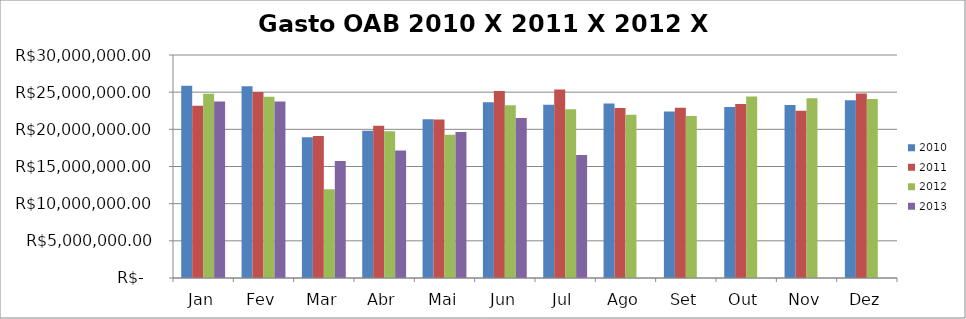
| Category | 2010 | 2011 | 2012 | 2013 |
|---|---|---|---|---|
| Jan | 25865872.94 | 23170130.5 | 24780138.68 | 23753127.04 |
| Fev | 25808496.98 | 25028056.29 | 24372694.95 | 23729691.57 |
| Mar | 18942208.98 | 19094225.19 | 11955866.25 | 15731767.78 |
| Abr | 19793070.31 | 20493892.54 | 19749503.8 | 17150642.43 |
| Mai | 21350827.83 | 21330943.72 | 19257337.9 | 19650299.26 |
| Jun | 23653717.91 | 25172002.57 | 23239697.85 | 21508349.86 |
| Jul | 23323558.73 | 25356536.86 | 22714401.87 | 16553673.91 |
| Ago | 23490481.52 | 22858462.32 | 21962989.09 | 0 |
| Set | 22410618.33 | 22898664.65 | 21803462.8 | 0 |
| Out | 23011698.34 | 23394638.17 | 24405048.48 | 0 |
| Nov | 23258393.29 | 22490263.61 | 24195833.28 | 0 |
| Dez | 23927715.46 | 24837194.24 | 24092535.98 | 0 |